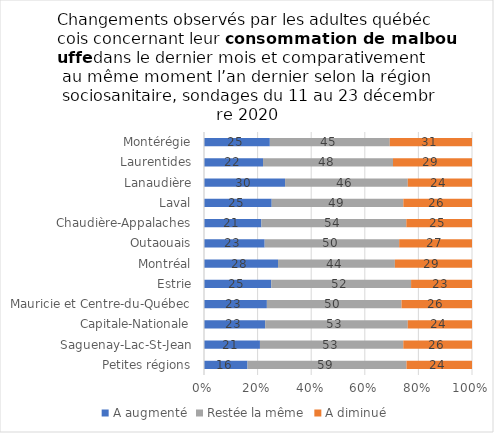
| Category | A augmenté | Restée la même | A diminué |
|---|---|---|---|
| Petites régions | 16.23 | 59.338 | 24.433 |
| Saguenay-Lac-St-Jean | 20.877 | 53.484 | 25.639 |
| Capitale-Nationale | 22.818 | 53.225 | 23.957 |
| Mauricie et Centre-du-Québec | 23.464 | 50.243 | 26.293 |
| Estrie | 25.108 | 52.16 | 22.732 |
| Montréal | 27.62 | 43.609 | 28.771 |
| Outaouais | 22.643 | 50.176 | 27.181 |
| Chaudière-Appalaches | 21.425 | 54.067 | 24.508 |
| Laval | 25.266 | 49.112 | 25.622 |
| Lanaudière | 30.244 | 45.793 | 23.963 |
| Laurentides | 22.023 | 48.498 | 29.479 |
| Montérégie | 24.564 | 44.752 | 30.684 |